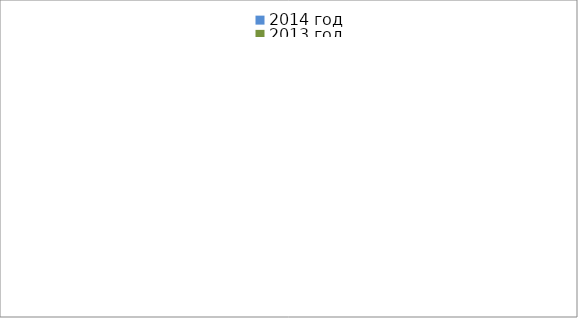
| Category | 2014 год | 2013 год |
|---|---|---|
|  - поджог | 23 | 35 |
|  - неосторожное обращение с огнём | 48 | 59 |
|  - НПТЭ электрооборудования | 18 | 22 |
|  - НПУ и Э печей | 72 | 58 |
|  - НПУ и Э транспортных средств | 62 | 55 |
|   -Шалость с огнем детей | 1 | 4 |
|  -НППБ при эксплуатации эл.приборов | 20 | 27 |
|  - курение | 21 | 12 |
| - прочие | 93 | 82 |
| - не установленные причины | 8 | 3 |